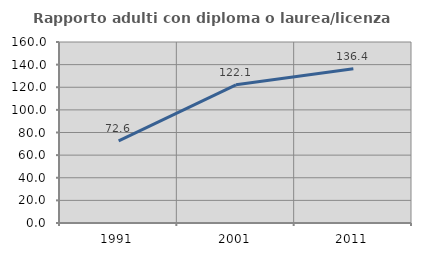
| Category | Rapporto adulti con diploma o laurea/licenza media  |
|---|---|
| 1991.0 | 72.558 |
| 2001.0 | 122.128 |
| 2011.0 | 136.398 |